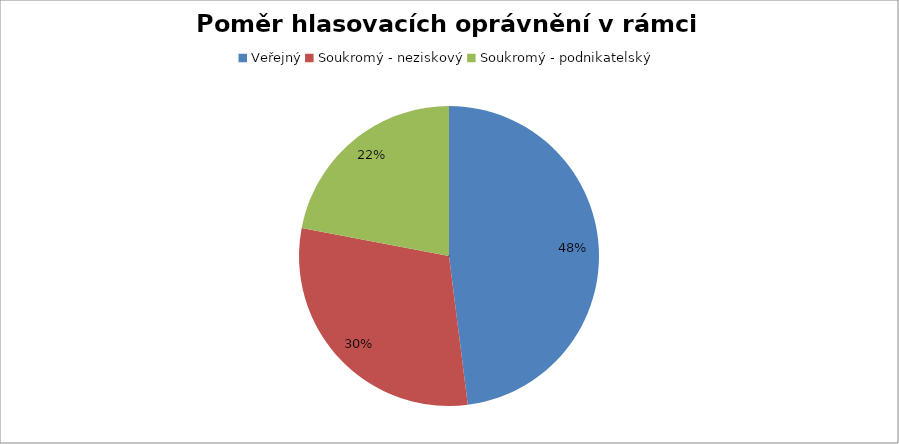
| Category | Series 0 |
|---|---|
| Veřejný | 0.48 |
| Soukromý - neziskový | 0.3 |
| Soukromý - podnikatelský | 0.22 |